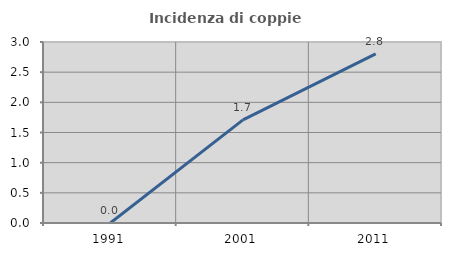
| Category | Incidenza di coppie miste |
|---|---|
| 1991.0 | 0 |
| 2001.0 | 1.709 |
| 2011.0 | 2.804 |